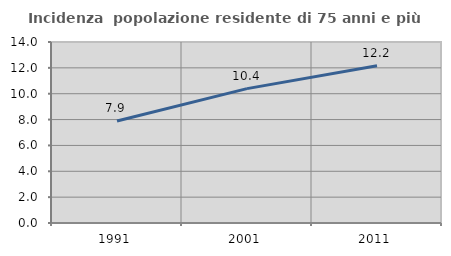
| Category | Incidenza  popolazione residente di 75 anni e più |
|---|---|
| 1991.0 | 7.886 |
| 2001.0 | 10.393 |
| 2011.0 | 12.16 |